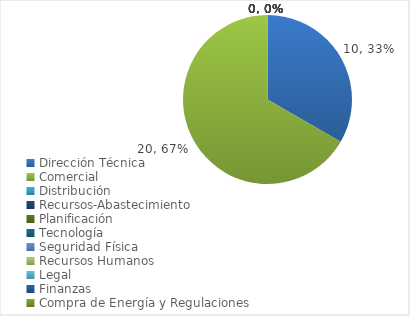
| Category | Series 0 |
|---|---|
| Dirección Técnica | 10 |
| Comercial | 20 |
| Distribución | 0 |
| Recursos-Abastecimiento | 0 |
| Planificación | 0 |
| Tecnología | 0 |
| Seguridad Física | 0 |
| Recursos Humanos | 0 |
| Legal | 0 |
| Finanzas | 0 |
| Compra de Energía y Regulaciones | 0 |